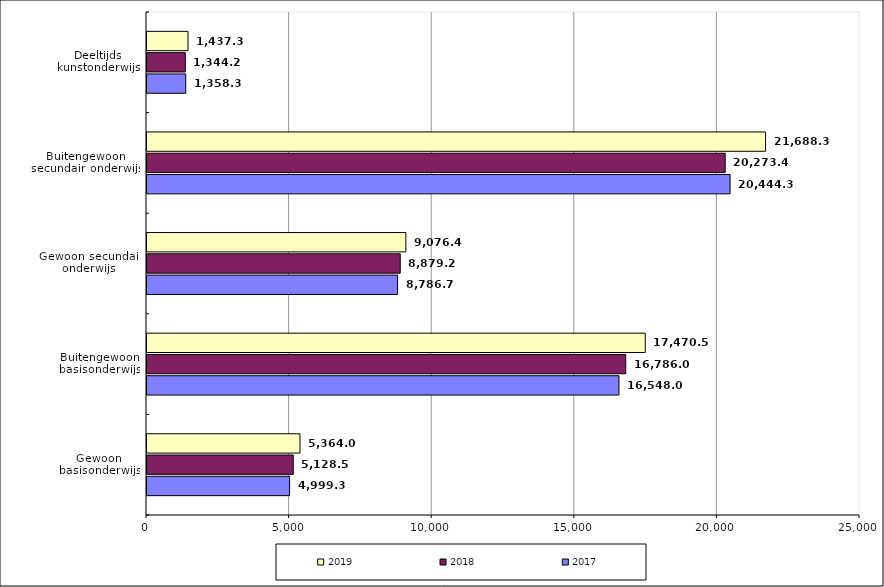
| Category | 2017 | 2018 | 2019 |
|---|---|---|---|
| Gewoon basisonderwijs | 4999.372 | 5128.561 | 5364.04 |
| Buitengewoon basisonderwijs | 16548.021 | 16786.065 | 17470.547 |
| Gewoon secundair onderwijs | 8786.774 | 8879.222 | 9076.439 |
| Buitengewoon secundair onderwijs | 20444.323 | 20273.489 | 21688.331 |
| Deeltijds kunstonderwijs | 1358.356 | 1344.256 | 1437.332 |